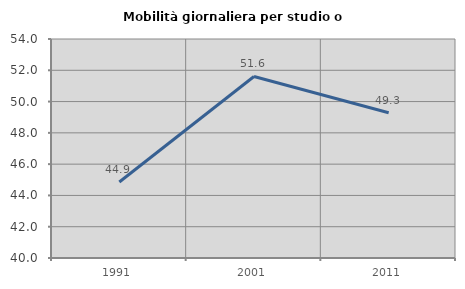
| Category | Mobilità giornaliera per studio o lavoro |
|---|---|
| 1991.0 | 44.856 |
| 2001.0 | 51.603 |
| 2011.0 | 49.286 |